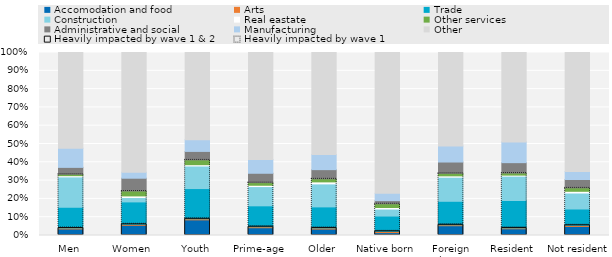
| Category | Accomodation and food | Arts | Trade | Construction | Real eastate | Other services | Administrative and social | Manufacturing | Other |
|---|---|---|---|---|---|---|---|---|---|
| Men | 0.036 | 0.005 | 0.113 | 0.166 | 0.007 | 0.008 | 0.038 | 0.105 | 0.523 |
| Women | 0.056 | 0.005 | 0.122 | 0.024 | 0.009 | 0.027 | 0.07 | 0.033 | 0.654 |
| Youth | 0.085 | 0.006 | 0.165 | 0.123 | 0.007 | 0.026 | 0.046 | 0.064 | 0.476 |
| Prime-age | 0.043 | 0.005 | 0.114 | 0.105 | 0.007 | 0.014 | 0.051 | 0.075 | 0.585 |
| Older | 0.035 | 0.006 | 0.115 | 0.126 | 0.011 | 0.017 | 0.05 | 0.082 | 0.558 |
| Native born | 0.016 | 0.007 | 0.084 | 0.038 | 0.008 | 0.02 | 0.017 | 0.04 | 0.77 |
| Foreign born | 0.053 | 0.005 | 0.129 | 0.132 | 0.007 | 0.014 | 0.062 | 0.088 | 0.511 |
| Resident | 0.037 | 0.004 | 0.15 | 0.133 | 0.005 | 0.011 | 0.057 | 0.113 | 0.489 |
| Not resident | 0.05 | 0.006 | 0.089 | 0.087 | 0.009 | 0.019 | 0.046 | 0.044 | 0.65 |